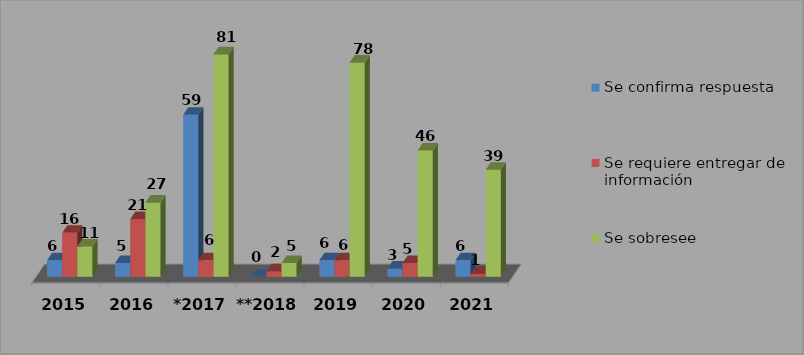
| Category | Se confirma respuesta | Se requiere entregar de información  | Se sobresee  |
|---|---|---|---|
| 2015 | 6 | 16 | 11 |
| 2016 | 5 | 21 | 27 |
| *2017 | 59 | 6 | 81 |
| **2018 | 0 | 2 | 5 |
| 2019 | 6 | 6 | 78 |
| 2020 | 3 | 5 | 46 |
| 2021 | 6 | 1 | 39 |